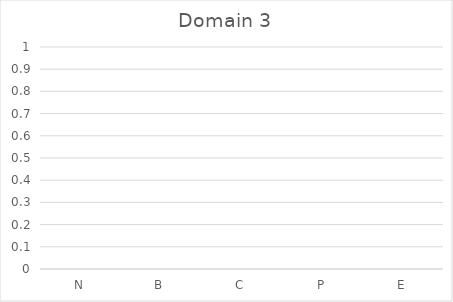
| Category | Series 0 |
|---|---|
| N | 0 |
| B | 0 |
| C | 0 |
| P | 0 |
| E | 0 |